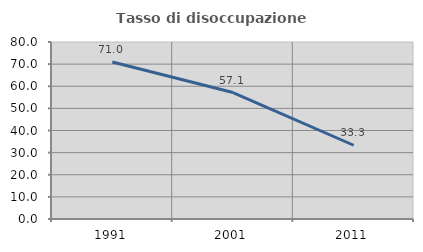
| Category | Tasso di disoccupazione giovanile  |
|---|---|
| 1991.0 | 70.968 |
| 2001.0 | 57.143 |
| 2011.0 | 33.333 |